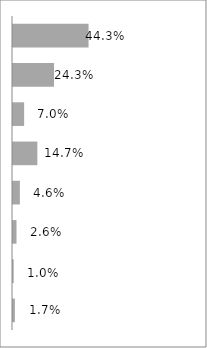
| Category | Series 0 |
|---|---|
| Excel School - Dashboards Membership | 0.443 |
| PM Templates for Excel [2007] | 0.243 |
| Excel School - Download Membership | 0.07 |
| Dashboard Tutorial #1 | 0.147 |
| PM Templates for Excel [both] | 0.046 |
| PM Templates for Excel [2003] | 0.026 |
| Excel School - Online Membership | 0.01 |
| Excel Formula e-book | 0.017 |